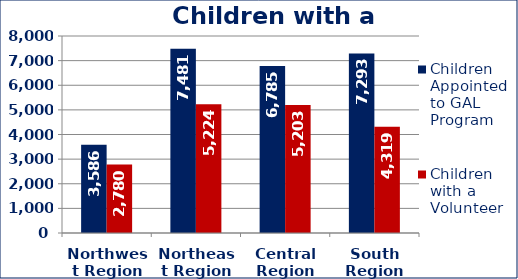
| Category | Children Appointed to GAL Program  | Children with a Volunteer  |
|---|---|---|
| Northwest Region | 3586 | 2780 |
| Northeast Region | 7481 | 5224 |
| Central Region | 6785 | 5203 |
| South Region | 7293 | 4319 |